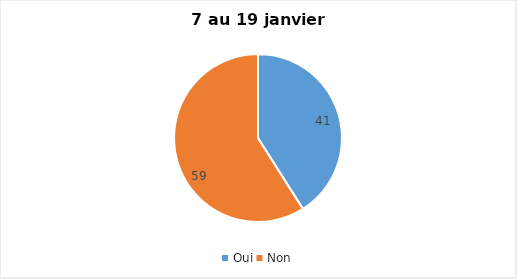
| Category | Series 0 |
|---|---|
| Oui | 41 |
| Non | 59 |